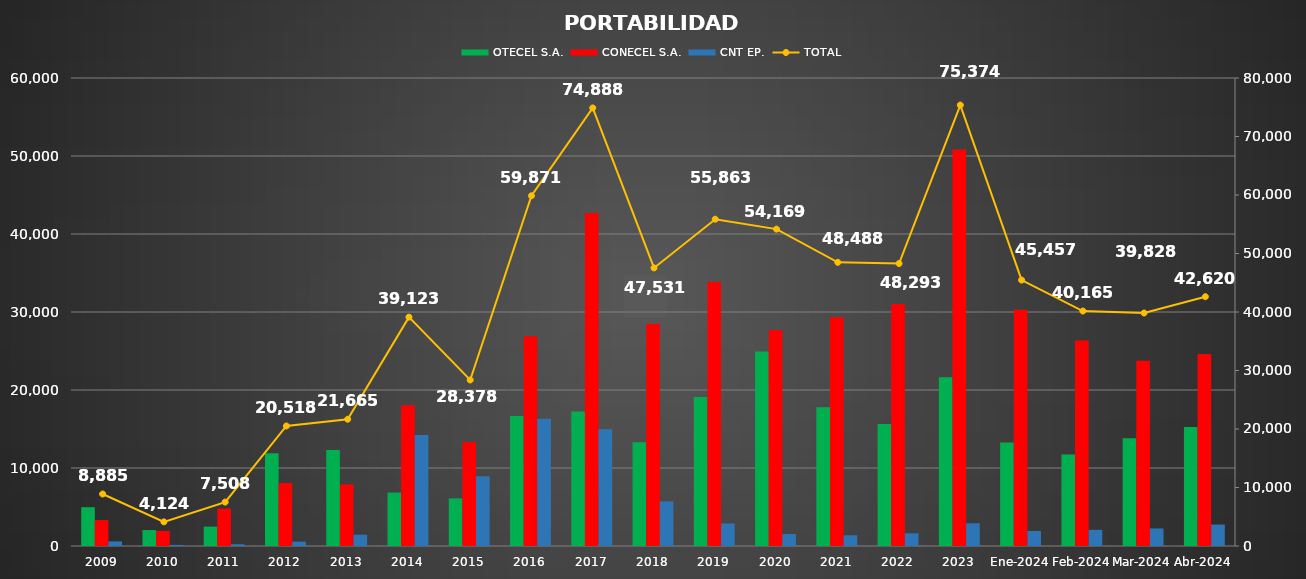
| Category | OTECEL S.A. | CONECEL S.A. | CNT EP. |
|---|---|---|---|
| 2009 | 4973 | 3324 | 588 |
| 2010 | 2045 | 1939 | 140 |
| 2011 | 2484 | 4796 | 228 |
| 2012 | 11894 | 8067 | 557 |
| 2013 | 12323 | 7893 | 1449 |
| 2014 | 6853 | 18039 | 14231 |
| 2015 | 6105 | 13334 | 8939 |
| 2016 | 16653 | 26907 | 16311 |
| 2017 | 17228 | 42694 | 14966 |
| 2018 | 13309 | 28504 | 5718 |
| 2019 | 19116 | 33857 | 2890 |
| 2020 | 24933 | 27700 | 1536 |
| 2021 | 17795 | 29321 | 1372 |
| 2022 | 15655 | 31012 | 1626 |
| 2023 | 21620 | 50836 | 2918 |
| Ene-2024 | 13255 | 30273 | 1929 |
| Feb-2024 | 11745 | 26350 | 2070 |
| Mar-2024 | 13823 | 23756 | 2249 |
| Abr-2024 | 15253 | 24619 | 2748 |